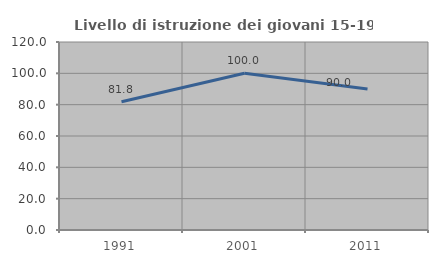
| Category | Livello di istruzione dei giovani 15-19 anni |
|---|---|
| 1991.0 | 81.818 |
| 2001.0 | 100 |
| 2011.0 | 90 |